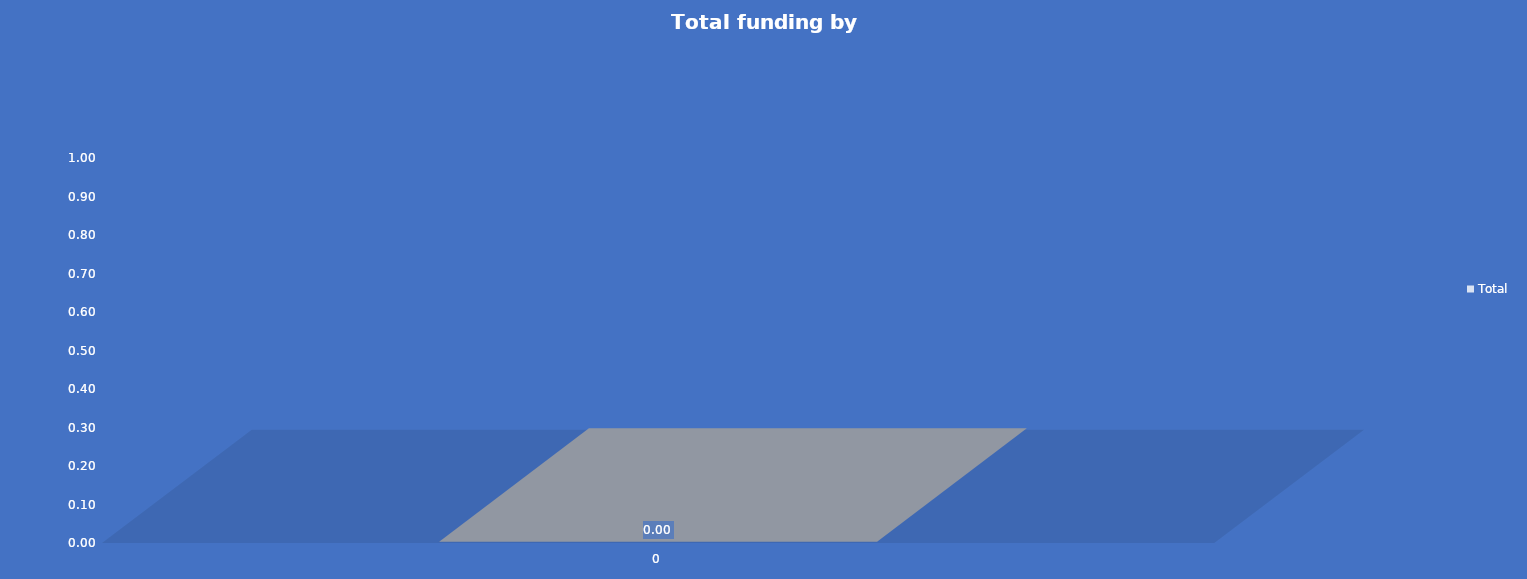
| Category | Total |
|---|---|
| #N/A | 0 |